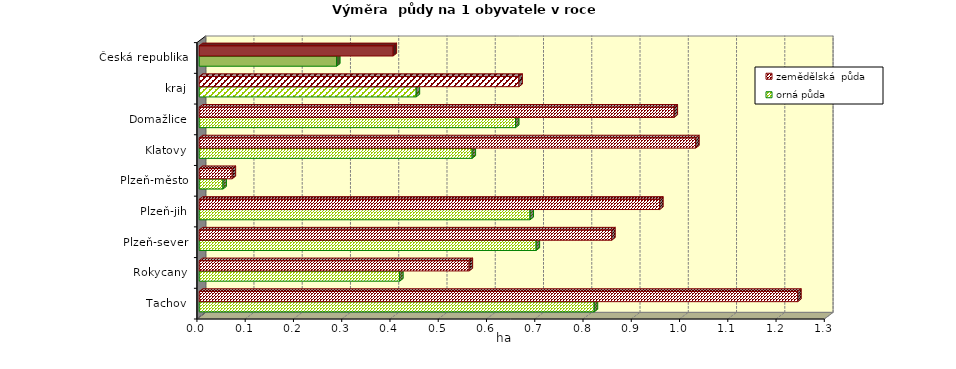
| Category | orná půda | zemědělská  půda |
|---|---|---|
| Tachov | 0.818 | 1.24 |
| Rokycany | 0.415 | 0.559 |
| Plzeň-sever | 0.698 | 0.855 |
| Plzeň-jih | 0.685 | 0.954 |
| Plzeň-město | 0.049 | 0.068 |
| Klatovy | 0.565 | 1.029 |
| Domažlice | 0.655 | 0.984 |
| kraj | 0.45 | 0.662 |
| Česká republika | 0.285 | 0.402 |